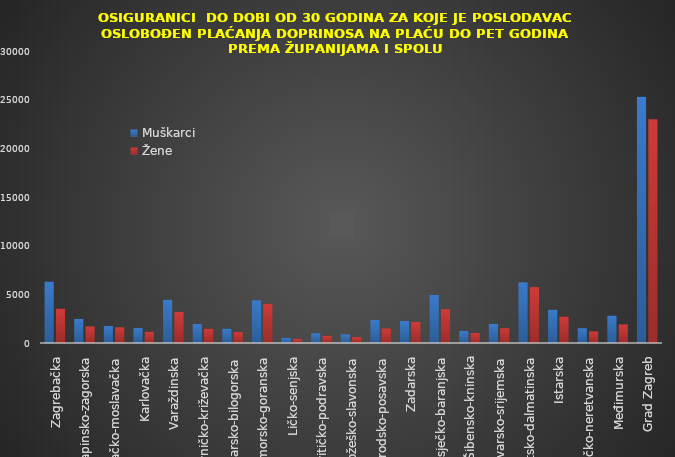
| Category | Muškarci | Žene |
|---|---|---|
| Zagrebačka | 6316 | 3533 |
| Krapinsko-zagorska | 2475 | 1702 |
| Sisačko-moslavačka | 1751 | 1615 |
| Karlovačka | 1537 | 1165 |
| Varaždinska | 4434 | 3204 |
| Koprivničko-križevačka | 1945 | 1470 |
| Bjelovarsko-bilogorska | 1469 | 1133 |
| Primorsko-goranska | 4380 | 4035 |
| Ličko-senjska | 542 | 425 |
| Virovitičko-podravska | 1000 | 743 |
| Požeško-slavonska | 885 | 606 |
| Brodsko-posavska | 2377 | 1491 |
| Zadarska | 2271 | 2155 |
| Osječko-baranjska | 4940 | 3482 |
| Šibensko-kninska | 1231 | 1021 |
| Vukovarsko-srijemska | 1974 | 1516 |
| Splitsko-dalmatinska | 6229 | 5740 |
| Istarska | 3428 | 2717 |
| Dubrovačko-neretvanska | 1517 | 1189 |
| Međimurska | 2817 | 1911 |
| Grad Zagreb | 25297 | 22990 |